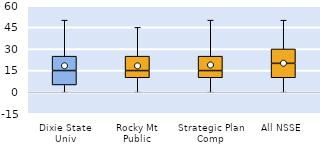
| Category | 25th | 50th | 75th |
|---|---|---|---|
| Dixie State Univ | 5 | 10 | 10 |
| Rocky Mt Public | 10 | 5 | 10 |
| Strategic Plan Comp | 10 | 5 | 10 |
| All NSSE | 10 | 10 | 10 |